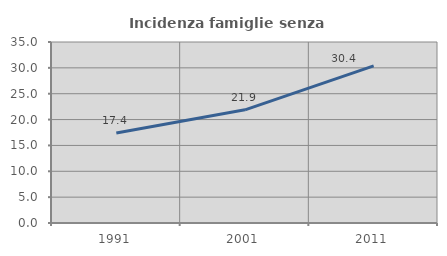
| Category | Incidenza famiglie senza nuclei |
|---|---|
| 1991.0 | 17.418 |
| 2001.0 | 21.89 |
| 2011.0 | 30.377 |